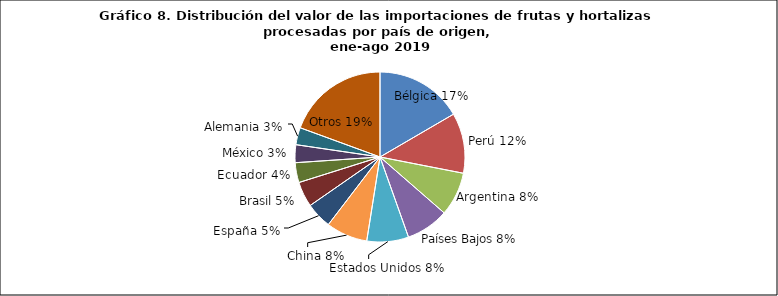
| Category | Series 0 |
|---|---|
| Bélgica | 43927834.3 |
| Perú | 30338156.62 |
| Argentina | 22059599.14 |
| Países Bajos | 21563187.71 |
| Estados Unidos | 21001805.19 |
| China | 20872764.24 |
| España | 13106642.59 |
| Brasil | 12713663.2 |
| Ecuador | 10005792.91 |
| México | 8967731.73 |
| Alemania | 8647653.06 |
| Otros | 51365219.77 |